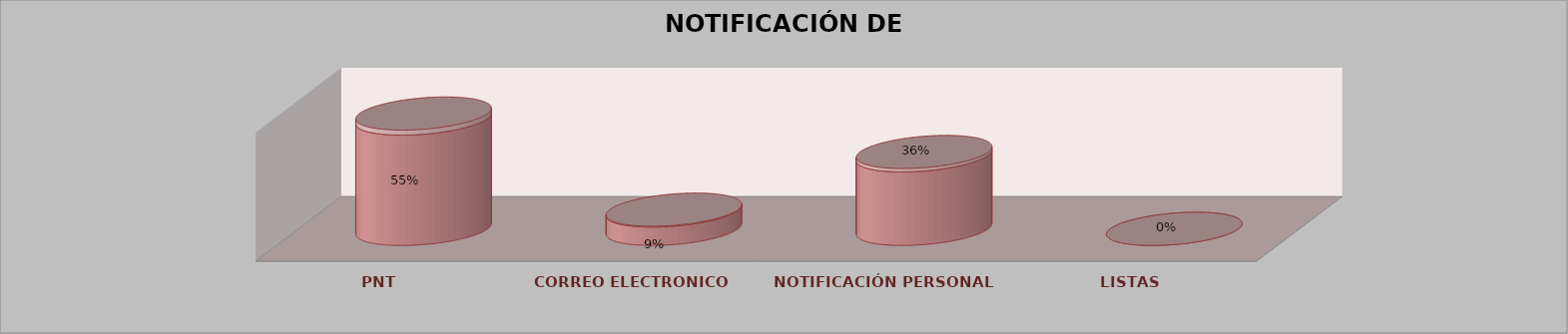
| Category | Series 0 | Series 1 | Series 2 | Series 3 | Series 4 |
|---|---|---|---|---|---|
| PNT |  |  |  | 12 | 0.545 |
| CORREO ELECTRONICO |  |  |  | 2 | 0.091 |
| NOTIFICACIÓN PERSONAL |  |  |  | 8 | 0.364 |
| LISTAS |  |  |  | 0 | 0 |